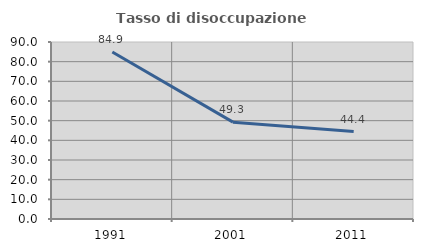
| Category | Tasso di disoccupazione giovanile  |
|---|---|
| 1991.0 | 84.884 |
| 2001.0 | 49.254 |
| 2011.0 | 44.444 |